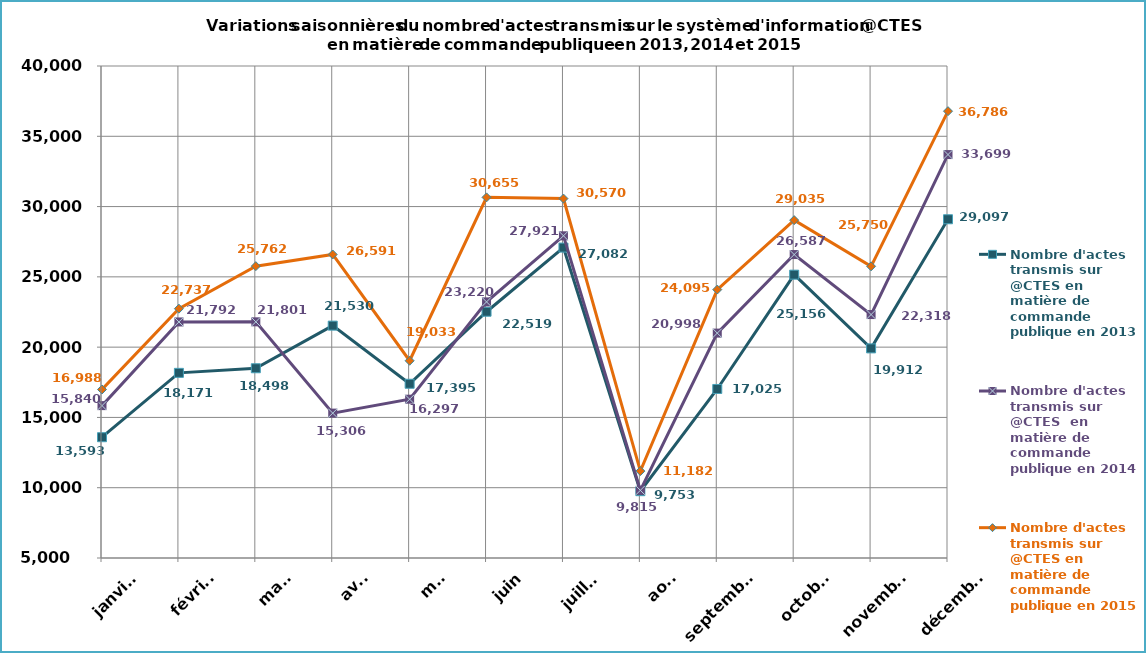
| Category | Nombre d'actes transmis sur @CTES en matière de commande publique en 2013 | Nombre d'actes transmis sur @CTES  en matière de commande publique en 2014 | Nombre d'actes transmis sur @CTES en matière de commande publique en 2015 |
|---|---|---|---|
| janvier | 13593 | 15840 | 16988 |
| février | 18171 | 21792 | 22737 |
| mars | 18498 | 21801 | 25762 |
| avril | 21530 | 15306 | 26591 |
| mai | 17395 | 16297 | 19033 |
| juin | 22519 | 23220 | 30655 |
| juillet | 27082 | 27921 | 30570 |
| août | 9753 | 9815 | 11182 |
| septembre | 17025 | 20998 | 24095 |
| octobre | 25156 | 26587 | 29035 |
| novembre | 19912 | 22318 | 25750 |
| décembre | 29097 | 33699 | 36786 |